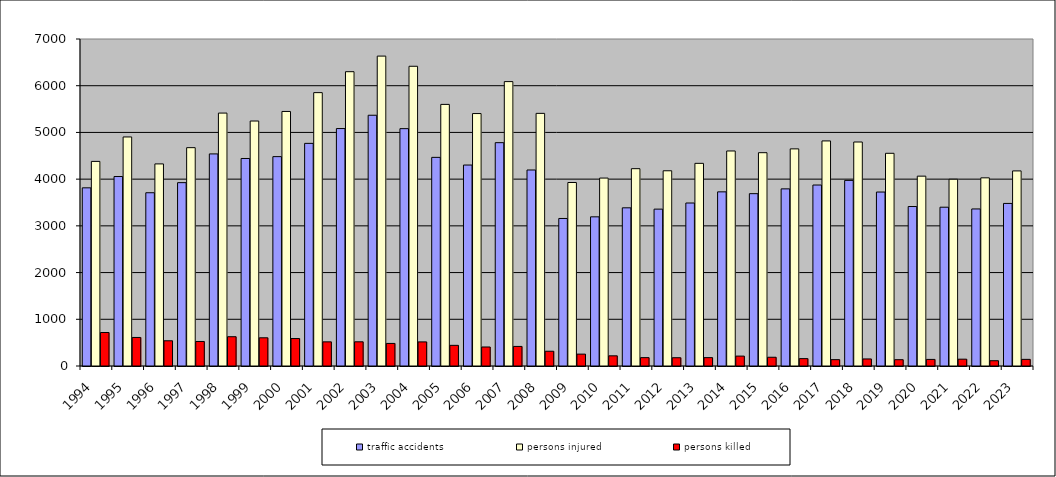
| Category | traffic accidents | persons injured | persons killed |
|---|---|---|---|
| 1994.0 | 3814 | 4380 | 717 |
| 1995.0 | 4056 | 4903 | 611 |
| 1996.0 | 3709 | 4326 | 540 |
| 1997.0 | 3925 | 4674 | 525 |
| 1998.0 | 4540 | 5414 | 627 |
| 1999.0 | 4442 | 5244 | 604 |
| 2000.0 | 4482 | 5449 | 588 |
| 2001.0 | 4766 | 5852 | 517 |
| 2002.0 | 5083 | 6300 | 518 |
| 2003.0 | 5368 | 6634 | 483 |
| 2004.0 | 5081 | 6416 | 516 |
| 2005.0 | 4466 | 5600 | 442 |
| 2006.0 | 4302 | 5404 | 407 |
| 2007.0 | 4781 | 6088 | 419 |
| 2008.0 | 4196 | 5408 | 316 |
| 2009.0 | 3158 | 3928 | 254 |
| 2010.0 | 3193 | 4023 | 218 |
| 2011.0 | 3386 | 4224 | 179 |
| 2012.0 | 3358 | 4179 | 177 |
| 2013.0 | 3489 | 4338 | 179 |
| 2014.0 | 3728 | 4603 | 212 |
| 2015.0 | 3689 | 4566 | 187 |
| 2016.0 | 3792 | 4648 | 158 |
| 2017.0 | 3874 | 4818 | 136 |
| 2018.0 | 3973 | 4795 | 151 |
| 2019.0 | 3724 | 4553 | 135 |
| 2020.0 | 3414 | 4064 | 141 |
| 2021.0 | 3399 | 3998 | 146 |
| 2022.0 | 3362 | 4028 | 113 |
| 2023.0 | 3480 | 4176 | 142 |